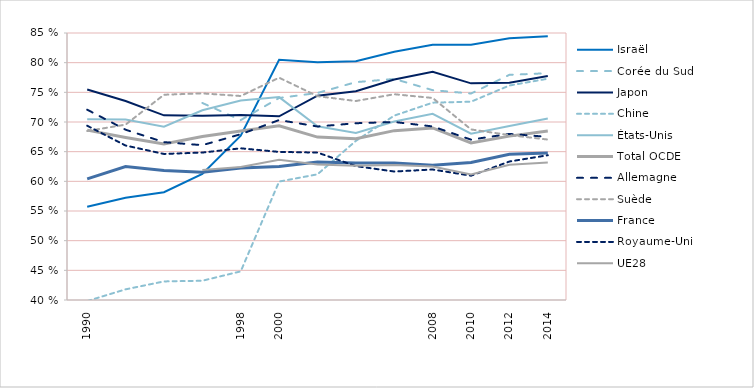
| Category | Israël | Corée du Sud | Japon | Chine | États-Unis | Total OCDE | Allemagne | Suède | France | Royaume-Uni | UE28 |
|---|---|---|---|---|---|---|---|---|---|---|---|
| 1990 | 55.702 | 0 | 75.481 | 39.822 | 70.48 | 68.628 | 72.075 | 68.479 | 60.419 | 69.369 | 0 |
|  | 57.229 | 0 | 73.537 | 41.797 | 70.406 | 67.396 | 68.7 | 69.557 | 62.484 | 66.036 | 0 |
|  | 58.16 | 0 | 71.12 | 43.13 | 69.212 | 66.294 | 66.604 | 74.596 | 61.84 | 64.615 | 0 |
|  | 61.253 | 73.208 | 71.059 | 43.248 | 71.98 | 67.544 | 66.097 | 74.823 | 61.545 | 64.851 | 61.925 |
| 1998 | 67.692 | 70.321 | 71.197 | 44.825 | 73.635 | 68.485 | 67.939 | 74.381 | 62.261 | 65.566 | 62.434 |
| 2000 | 80.475 | 74.049 | 70.961 | 59.961 | 74.193 | 69.35 | 70.329 | 77.467 | 62.508 | 64.96 | 63.638 |
|  | 80.067 | 74.893 | 74.442 | 61.184 | 69.266 | 67.458 | 69.242 | 74.352 | 63.251 | 64.849 | 62.848 |
|  | 80.227 | 76.716 | 75.191 | 66.823 | 68.152 | 67.164 | 69.793 | 73.539 | 63.104 | 62.563 | 62.626 |
|  | 81.836 | 77.258 | 77.155 | 71.078 | 70.096 | 68.544 | 70.004 | 74.68 | 63.081 | 61.654 | 62.758 |
| 2008 | 83.03 | 75.367 | 78.462 | 73.26 | 71.379 | 69.005 | 69.25 | 74.052 | 62.731 | 61.994 | 62.516 |
| 2010 | 83.011 | 74.8 | 76.514 | 73.422 | 68.028 | 66.465 | 67.028 | 68.747 | 63.159 | 60.949 | 61.15 |
| 2012 | 84.111 | 77.949 | 76.623 | 76.15 | 69.311 | 67.621 | 67.994 | 67.788 | 64.579 | 63.344 | 62.807 |
| 2014 | 84.464 | 78.223 | 77.757 | 77.297 | 70.579 | 68.486 | 67.488 | 67.043 | 64.775 | 64.398 | 63.176 |